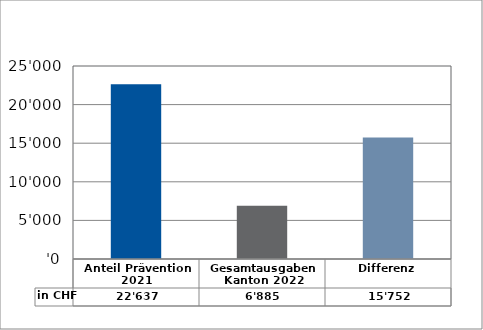
| Category | in CHF |
|---|---|
| Anteil Prävention 2021

 | 22637 |
| Gesamtausgaben Kanton 2022
 | 6885 |
| Differenz | 15752 |